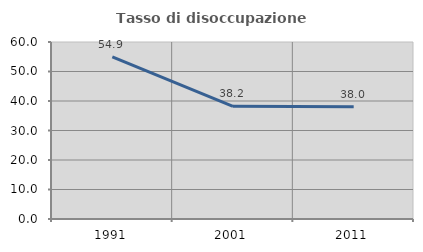
| Category | Tasso di disoccupazione giovanile  |
|---|---|
| 1991.0 | 54.948 |
| 2001.0 | 38.182 |
| 2011.0 | 38.021 |